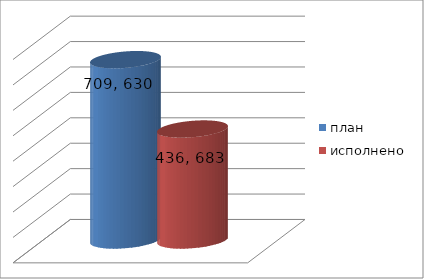
| Category | план | исполнено |
|---|---|---|
| 0 | 709630218.66 | 436683294.54 |